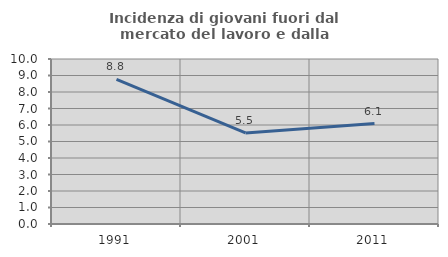
| Category | Incidenza di giovani fuori dal mercato del lavoro e dalla formazione  |
|---|---|
| 1991.0 | 8.77 |
| 2001.0 | 5.518 |
| 2011.0 | 6.085 |